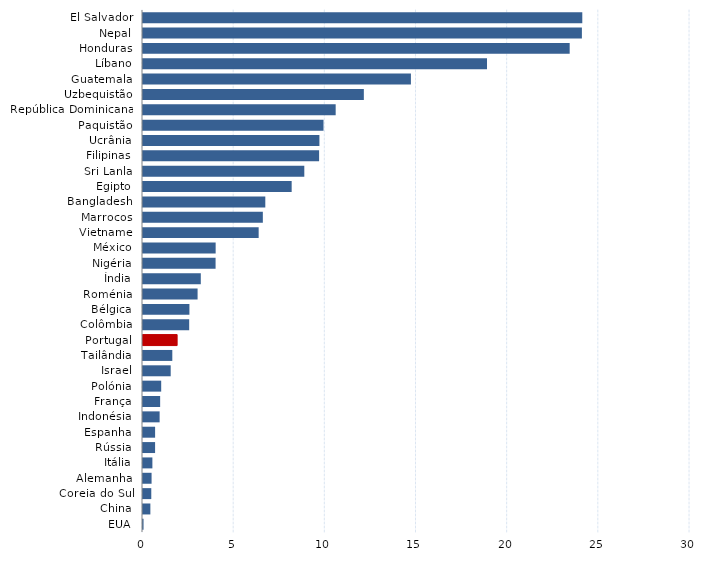
| Category | Series 0 |
|---|---|
| El Salvador | 24.093 |
| Nepal | 24.071 |
| Honduras | 23.401 |
| Líbano | 18.867 |
| Guatemala | 14.694 |
| Uzbequistão | 12.112 |
| República Dominicana | 10.567 |
| Paquistão | 9.9 |
| Ucrânia | 9.676 |
| Filipinas | 9.658 |
| Sri Lanla | 8.847 |
| Egipto | 8.154 |
| Bangladesh | 6.708 |
| Marrocos | 6.573 |
| Vietname | 6.343 |
| México | 3.985 |
| Nigéria | 3.981 |
| Índia | 3.17 |
| Roménia | 2.994 |
| Bélgica | 2.546 |
| Colômbia | 2.533 |
| Portugal | 1.871 |
| Tailândia | 1.608 |
| Israel | 1.519 |
| Polónia | 0.998 |
| França | 0.941 |
| Indonésia | 0.912 |
| Espanha | 0.664 |
| Rússia | 0.663 |
| Itália | 0.515 |
| Alemanha | 0.47 |
| Coreia do Sul | 0.455 |
| China | 0.404 |
| EUA | 0.029 |